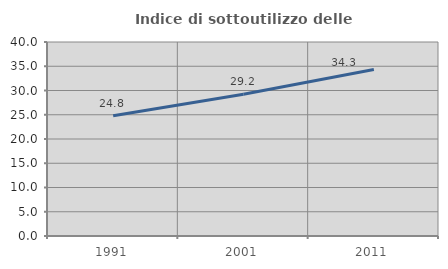
| Category | Indice di sottoutilizzo delle abitazioni  |
|---|---|
| 1991.0 | 24.789 |
| 2001.0 | 29.237 |
| 2011.0 | 34.334 |